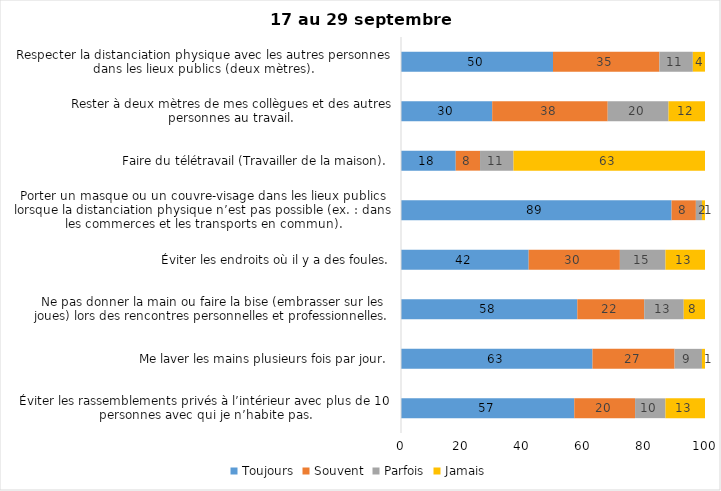
| Category | Toujours | Souvent | Parfois | Jamais |
|---|---|---|---|---|
| Éviter les rassemblements privés à l’intérieur avec plus de 10 personnes avec qui je n’habite pas. | 57 | 20 | 10 | 13 |
| Me laver les mains plusieurs fois par jour. | 63 | 27 | 9 | 1 |
| Ne pas donner la main ou faire la bise (embrasser sur les joues) lors des rencontres personnelles et professionnelles. | 58 | 22 | 13 | 8 |
| Éviter les endroits où il y a des foules. | 42 | 30 | 15 | 13 |
| Porter un masque ou un couvre-visage dans les lieux publics lorsque la distanciation physique n’est pas possible (ex. : dans les commerces et les transports en commun). | 89 | 8 | 2 | 1 |
| Faire du télétravail (Travailler de la maison). | 18 | 8 | 11 | 63 |
| Rester à deux mètres de mes collègues et des autres personnes au travail. | 30 | 38 | 20 | 12 |
| Respecter la distanciation physique avec les autres personnes dans les lieux publics (deux mètres). | 50 | 35 | 11 | 4 |